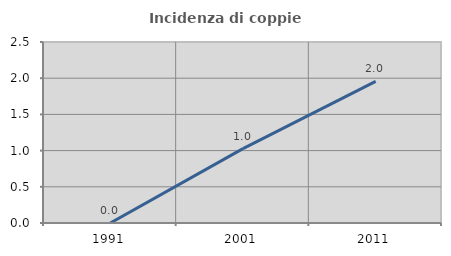
| Category | Incidenza di coppie miste |
|---|---|
| 1991.0 | 0 |
| 2001.0 | 1.027 |
| 2011.0 | 1.957 |